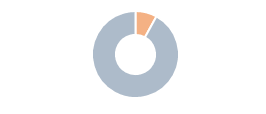
| Category | Series 0 |
|---|---|
| 0 | 0.08 |
| 1 | 0.92 |